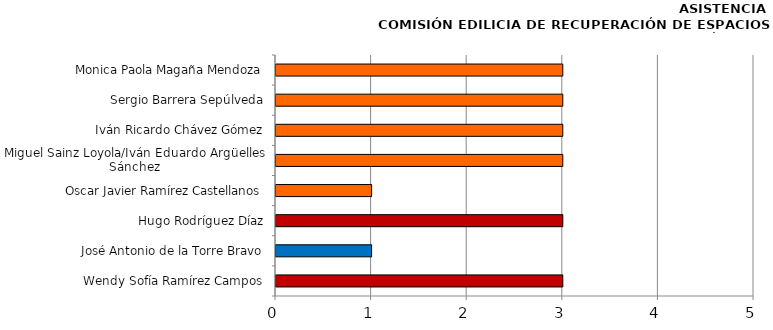
| Category | Series 0 |
|---|---|
| Wendy Sofía Ramírez Campos | 3 |
| José Antonio de la Torre Bravo | 1 |
| Hugo Rodríguez Díaz | 3 |
| Oscar Javier Ramírez Castellanos | 1 |
| Miguel Sainz Loyola/Iván Eduardo Argüelles Sánchez | 3 |
| Iván Ricardo Chávez Gómez | 3 |
| Sergio Barrera Sepúlveda | 3 |
| Monica Paola Magaña Mendoza | 3 |